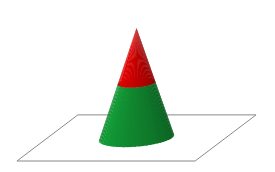
| Category | Series 0 | Series 1 |
|---|---|---|
| 0 | 2 | 2 |